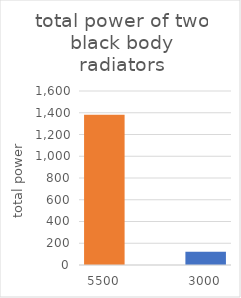
| Category | Series 0 |
|---|---|
| 5500.0 | 1381.852 |
| nan | 0 |
| 3000.0 | 122.254 |